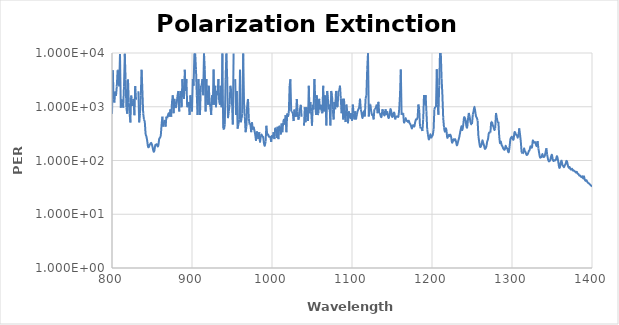
| Category | PER |
|---|---|
| 800.0 | 737.103 |
| 801.0 | 4788.855 |
| 802.0 | 1366.677 |
| 803.0 | 1195.963 |
| 804.0 | 1913.677 |
| 805.0 | 1595.165 |
| 806.0 | 2391.878 |
| 807.0 | 4781.694 |
| 808.0 | 4782.242 |
| 809.0 | 2396.13 |
| 810.0 | 9595.761 |
| 811.0 | 959.612 |
| 812.0 | 1371.975 |
| 813.0 | 1201.485 |
| 814.0 | 962.903 |
| 815.0 | 2406.201 |
| 816.0 | 9643.159 |
| 817.0 | 3214.255 |
| 818.0 | 964.865 |
| 819.0 | 743.864 |
| 820.0 | 3224.098 |
| 821.0 | 1207.928 |
| 822.0 | 744.744 |
| 823.0 | 509.599 |
| 824.0 | 1615.958 |
| 825.0 | 1212.327 |
| 826.0 | 1077.016 |
| 827.0 | 1387.672 |
| 828.0 | 693.208 |
| 829.0 | 2421.73 |
| 830.0 | 1385.673 |
| 831.0 | 1387.615 |
| 832.0 | 0 |
| 833.0 | 1939.557 |
| 834.0 | 511.584 |
| 835.0 | 749.014 |
| 836.0 | 1624.201 |
| 837.0 | 4882.862 |
| 838.0 | 1953.607 |
| 839.0 | 750.488 |
| 840.0 | 573.973 |
| 841.0 | 513.61 |
| 842.0 | 315.043 |
| 843.0 | 279.44 |
| 844.0 | 232.914 |
| 845.0 | 181.011 |
| 846.0 | 177.634 |
| 847.0 | 195.237 |
| 848.0 | 203.438 |
| 849.0 | 212.668 |
| 850.0 | 195.838 |
| 851.0 | 168.946 |
| 852.0 | 146.405 |
| 853.0 | 152.539 |
| 854.0 | 191.278 |
| 855.0 | 195.772 |
| 856.0 | 200.386 |
| 857.0 | 182.489 |
| 858.0 | 192.845 |
| 859.0 | 251.333 |
| 860.0 | 264.858 |
| 861.0 | 297.054 |
| 862.0 | 467.044 |
| 863.0 | 654.03 |
| 864.0 | 426.676 |
| 865.0 | 516.773 |
| 866.0 | 545.298 |
| 867.0 | 426.782 |
| 868.0 | 654.217 |
| 869.0 | 613.019 |
| 870.0 | 700.578 |
| 871.0 | 754.556 |
| 872.0 | 654.443 |
| 873.0 | 892.333 |
| 874.0 | 653.956 |
| 875.0 | 1226.405 |
| 876.0 | 1634.2 |
| 877.0 | 754.52 |
| 878.0 | 1401.837 |
| 879.0 | 1089.715 |
| 880.0 | 981.116 |
| 881.0 | 1225.779 |
| 882.0 | 1634.9 |
| 883.0 | 1962.476 |
| 884.0 | 816.847 |
| 885.0 | 1633.751 |
| 886.0 | 1963.447 |
| 887.0 | 982.719 |
| 888.0 | 3275.977 |
| 889.0 | 1963.737 |
| 890.0 | 1400.67 |
| 891.0 | 4900.434 |
| 892.0 | 1961.832 |
| 893.0 | 3270.673 |
| 894.0 | 980.692 |
| 895.0 | 1089.984 |
| 896.0 | 1226.172 |
| 897.0 | 700.899 |
| 898.0 | 1637.363 |
| 899.0 | 1227.803 |
| 900.0 | 818.158 |
| 901.0 | 3272.012 |
| 902.0 | 2454.371 |
| 903.0 | 9815.599 |
| 904.0 | 9812.111 |
| 905.0 | 4908.162 |
| 906.0 | 1636.228 |
| 907.0 | 701.612 |
| 908.0 | 3275.091 |
| 909.0 | 1636.558 |
| 910.0 | 701.516 |
| 911.0 | 2457.207 |
| 912.0 | 2457.059 |
| 913.0 | 3275.152 |
| 914.0 | 1637.171 |
| 915.0 | 9825.997 |
| 916.0 | 4911.372 |
| 917.0 | 818.448 |
| 918.0 | 3273.944 |
| 919.0 | 1402.382 |
| 920.0 | 1091.061 |
| 921.0 | 2455.551 |
| 922.0 | 1228.091 |
| 923.0 | 982.903 |
| 924.0 | 702.421 |
| 925.0 | 1639.226 |
| 926.0 | 1091.823 |
| 927.0 | 4911.736 |
| 928.0 | 1091.32 |
| 929.0 | 2456.52 |
| 930.0 | 982.404 |
| 931.0 | 1966.334 |
| 932.0 | 1637.967 |
| 933.0 | 3276.289 |
| 934.0 | 1228.192 |
| 935.0 | 1091.818 |
| 936.0 | 2453.744 |
| 937.0 | 979.465 |
| 938.0 | 9816.631 |
| 939.0 | 393.633 |
| 940.0 | 378.614 |
| 941.0 | 467.885 |
| 942.0 | 3267.977 |
| 943.0 | 9797.694 |
| 944.0 | 3269.194 |
| 945.0 | 614.281 |
| 946.0 | 817.61 |
| 947.0 | 1088.067 |
| 948.0 | 2450.653 |
| 949.0 | 1962.253 |
| 950.0 | 1227.758 |
| 951.0 | 467.017 |
| 952.0 | 9798.13 |
| 953.0 | 0 |
| 954.0 | 3268.432 |
| 955.0 | 701.321 |
| 956.0 | 1960.843 |
| 957.0 | 391.371 |
| 958.0 | 465.972 |
| 959.0 | 576.041 |
| 960.0 | 4893.011 |
| 961.0 | 513.867 |
| 962.0 | 611.043 |
| 963.0 | 753.47 |
| 964.0 | 9784.02 |
| 965.0 | 1221.152 |
| 966.0 | 650.6 |
| 967.0 | 335.922 |
| 968.0 | 423.876 |
| 969.0 | 1085.282 |
| 970.0 | 1395.947 |
| 971.0 | 611.496 |
| 972.0 | 465.059 |
| 973.0 | 464.493 |
| 974.0 | 336.791 |
| 975.0 | 514.587 |
| 976.0 | 375.463 |
| 977.0 | 424.71 |
| 978.0 | 361.35 |
| 979.0 | 305.458 |
| 980.0 | 232.666 |
| 981.0 | 348.257 |
| 982.0 | 314.024 |
| 983.0 | 250.127 |
| 984.0 | 336.204 |
| 985.0 | 216.995 |
| 986.0 | 286.875 |
| 987.0 | 304.134 |
| 988.0 | 278.801 |
| 989.0 | 270.866 |
| 990.0 | 207.451 |
| 991.0 | 187.554 |
| 992.0 | 226.837 |
| 993.0 | 443.208 |
| 994.0 | 295.499 |
| 995.0 | 314.592 |
| 996.0 | 278.592 |
| 997.0 | 278.634 |
| 998.0 | 270.592 |
| 999.0 | 221.259 |
| 1000.0 | 295.27 |
| 1001.0 | 270.65 |
| 1002.0 | 336.109 |
| 1003.0 | 250.033 |
| 1004.0 | 406.321 |
| 1005.0 | 389.936 |
| 1006.0 | 263.47 |
| 1007.0 | 423.781 |
| 1008.0 | 249.812 |
| 1009.0 | 442.256 |
| 1010.0 | 423.137 |
| 1011.0 | 303.88 |
| 1012.0 | 487.146 |
| 1013.0 | 336.042 |
| 1014.0 | 513.296 |
| 1015.0 | 573.591 |
| 1016.0 | 464.477 |
| 1017.0 | 696.339 |
| 1018.0 | 336.366 |
| 1019.0 | 750.556 |
| 1020.0 | 650.406 |
| 1021.0 | 750.573 |
| 1022.0 | 2438.492 |
| 1023.0 | 3251.029 |
| 1024.0 | 812.418 |
| 1025.0 | 813.068 |
| 1026.0 | 750.997 |
| 1027.0 | 542.495 |
| 1028.0 | 887.983 |
| 1029.0 | 697.57 |
| 1030.0 | 650.909 |
| 1031.0 | 1394.828 |
| 1032.0 | 813.587 |
| 1033.0 | 574.356 |
| 1034.0 | 651.883 |
| 1035.0 | 888.096 |
| 1036.0 | 1085.055 |
| 1037.0 | 651.294 |
| 1038.0 | 0 |
| 1039.0 | 0 |
| 1040.0 | 444.889 |
| 1041.0 | 978.456 |
| 1042.0 | 515.045 |
| 1043.0 | 978.001 |
| 1044.0 | 890.271 |
| 1045.0 | 544.031 |
| 1046.0 | 2450.793 |
| 1047.0 | 753.688 |
| 1048.0 | 1223.747 |
| 1049.0 | 816.515 |
| 1050.0 | 445.527 |
| 1051.0 | 1088.552 |
| 1052.0 | 890.792 |
| 1053.0 | 3271.507 |
| 1054.0 | 1401.226 |
| 1055.0 | 700.966 |
| 1056.0 | 1635.988 |
| 1057.0 | 700.816 |
| 1058.0 | 755.106 |
| 1059.0 | 1402.84 |
| 1060.0 | 893.398 |
| 1061.0 | 1091.719 |
| 1062.0 | 818.15 |
| 1063.0 | 755.755 |
| 1064.0 | 2457.127 |
| 1065.0 | 819.386 |
| 1066.0 | 1638.194 |
| 1067.0 | 1229.789 |
| 1068.0 | 447.178 |
| 1069.0 | 1968.098 |
| 1070.0 | 1406.486 |
| 1071.0 | 894.584 |
| 1072.0 | 1093.837 |
| 1073.0 | 447.803 |
| 1074.0 | 1968.649 |
| 1075.0 | 1641.851 |
| 1076.0 | 895.128 |
| 1077.0 | 578.98 |
| 1078.0 | 1230.849 |
| 1079.0 | 895.268 |
| 1080.0 | 1971.29 |
| 1081.0 | 986.099 |
| 1082.0 | 986.972 |
| 1083.0 | 1975.914 |
| 1084.0 | 1975.029 |
| 1085.0 | 2466.507 |
| 1086.0 | 1410.022 |
| 1087.0 | 759.526 |
| 1088.0 | 1410.106 |
| 1089.0 | 580.677 |
| 1090.0 | 1410.006 |
| 1091.0 | 705.156 |
| 1092.0 | 519.544 |
| 1093.0 | 1097.145 |
| 1094.0 | 823.164 |
| 1095.0 | 493.747 |
| 1096.0 | 822.317 |
| 1097.0 | 705.428 |
| 1098.0 | 617.599 |
| 1099.0 | 759.725 |
| 1100.0 | 548.681 |
| 1101.0 | 1097.368 |
| 1102.0 | 759.328 |
| 1103.0 | 580.733 |
| 1104.0 | 823.227 |
| 1105.0 | 580.719 |
| 1106.0 | 705.161 |
| 1107.0 | 823.462 |
| 1108.0 | 898.086 |
| 1109.0 | 987.746 |
| 1110.0 | 1411.689 |
| 1111.0 | 898.399 |
| 1112.0 | 760.439 |
| 1113.0 | 617.596 |
| 1114.0 | 706.065 |
| 1115.0 | 823.567 |
| 1116.0 | 658.312 |
| 1117.0 | 1409.34 |
| 1118.0 | 1644.177 |
| 1119.0 | 4939.936 |
| 1120.0 | 9885.886 |
| 1121.0 | 658.612 |
| 1122.0 | 1097.33 |
| 1123.0 | 1096.773 |
| 1124.0 | 823.124 |
| 1125.0 | 705.863 |
| 1126.0 | 705.424 |
| 1127.0 | 581.111 |
| 1128.0 | 898.062 |
| 1129.0 | 897.631 |
| 1130.0 | 986.979 |
| 1131.0 | 1096.644 |
| 1132.0 | 759.078 |
| 1133.0 | 1233.797 |
| 1134.0 | 759.207 |
| 1135.0 | 759.431 |
| 1136.0 | 658.3 |
| 1137.0 | 658.51 |
| 1138.0 | 898.391 |
| 1139.0 | 823.955 |
| 1140.0 | 706.1 |
| 1141.0 | 705.845 |
| 1142.0 | 897.851 |
| 1143.0 | 705.412 |
| 1144.0 | 822.916 |
| 1145.0 | 658.247 |
| 1146.0 | 617.33 |
| 1147.0 | 705.844 |
| 1148.0 | 898.408 |
| 1149.0 | 822.989 |
| 1150.0 | 658.642 |
| 1151.0 | 658.453 |
| 1152.0 | 759.828 |
| 1153.0 | 759.757 |
| 1154.0 | 581.051 |
| 1155.0 | 658.63 |
| 1156.0 | 658.868 |
| 1157.0 | 658.932 |
| 1158.0 | 659.157 |
| 1159.0 | 899.412 |
| 1160.0 | 1648.303 |
| 1161.0 | 4949.016 |
| 1162.0 | 707.063 |
| 1163.0 | 760.471 |
| 1164.0 | 760.403 |
| 1165.0 | 494.404 |
| 1166.0 | 549.266 |
| 1167.0 | 617.999 |
| 1168.0 | 549.211 |
| 1169.0 | 549.276 |
| 1170.0 | 520.327 |
| 1171.0 | 549.13 |
| 1172.0 | 494.232 |
| 1173.0 | 470.735 |
| 1174.0 | 429.821 |
| 1175.0 | 395.196 |
| 1176.0 | 449.12 |
| 1177.0 | 449.186 |
| 1178.0 | 429.82 |
| 1179.0 | 520.463 |
| 1180.0 | 582.177 |
| 1181.0 | 582.189 |
| 1182.0 | 618.72 |
| 1183.0 | 1100.18 |
| 1184.0 | 899.906 |
| 1185.0 | 430.151 |
| 1186.0 | 395.689 |
| 1187.0 | 395.823 |
| 1188.0 | 353.457 |
| 1189.0 | 583.026 |
| 1190.0 | 1653.66 |
| 1191.0 | 1102.325 |
| 1192.0 | 1653.53 |
| 1193.0 | 826.584 |
| 1194.0 | 381.054 |
| 1195.0 | 299.962 |
| 1196.0 | 247.445 |
| 1197.0 | 267.477 |
| 1198.0 | 309.362 |
| 1199.0 | 267.709 |
| 1200.0 | 282.949 |
| 1201.0 | 300.465 |
| 1202.0 | 381.477 |
| 1203.0 | 901.881 |
| 1204.0 | 992.73 |
| 1205.0 | 993.73 |
| 1206.0 | 4974.092 |
| 1207.0 | 1105.846 |
| 1208.0 | 710.486 |
| 1209.0 | 2486.616 |
| 1210.0 | 9954.512 |
| 1211.0 | 9952.098 |
| 1212.0 | 3316.954 |
| 1213.0 | 1659.253 |
| 1214.0 | 622.172 |
| 1215.0 | 414.663 |
| 1216.0 | 343.102 |
| 1217.0 | 397.79 |
| 1218.0 | 368.225 |
| 1219.0 | 268.546 |
| 1220.0 | 275.62 |
| 1221.0 | 300.602 |
| 1222.0 | 283.838 |
| 1223.0 | 301.462 |
| 1224.0 | 268.981 |
| 1225.0 | 216.301 |
| 1226.0 | 225.897 |
| 1227.0 | 248.298 |
| 1228.0 | 236.602 |
| 1229.0 | 248.576 |
| 1230.0 | 226.035 |
| 1231.0 | 191.313 |
| 1232.0 | 207.07 |
| 1233.0 | 236.54 |
| 1234.0 | 269.07 |
| 1235.0 | 321.744 |
| 1236.0 | 383.59 |
| 1237.0 | 433.278 |
| 1238.0 | 369.016 |
| 1239.0 | 452.949 |
| 1240.0 | 623.546 |
| 1241.0 | 624.06 |
| 1242.0 | 554.729 |
| 1243.0 | 434.042 |
| 1244.0 | 415.74 |
| 1245.0 | 586.895 |
| 1246.0 | 768.152 |
| 1247.0 | 666.34 |
| 1248.0 | 526.006 |
| 1249.0 | 475.645 |
| 1250.0 | 475.693 |
| 1251.0 | 713.427 |
| 1252.0 | 833.021 |
| 1253.0 | 999.583 |
| 1254.0 | 832.662 |
| 1255.0 | 666.667 |
| 1256.0 | 624.286 |
| 1257.0 | 554.231 |
| 1258.0 | 284.799 |
| 1259.0 | 221.425 |
| 1260.0 | 181.135 |
| 1261.0 | 181.043 |
| 1262.0 | 199.018 |
| 1263.0 | 236.868 |
| 1264.0 | 211.77 |
| 1265.0 | 191.315 |
| 1266.0 | 165.677 |
| 1267.0 | 168.542 |
| 1268.0 | 184.13 |
| 1269.0 | 225.909 |
| 1270.0 | 248.914 |
| 1271.0 | 321.338 |
| 1272.0 | 332.267 |
| 1273.0 | 332.446 |
| 1274.0 | 524.719 |
| 1275.0 | 524.865 |
| 1276.0 | 453.036 |
| 1277.0 | 415.169 |
| 1278.0 | 369.482 |
| 1279.0 | 398.983 |
| 1280.0 | 766.953 |
| 1281.0 | 623.626 |
| 1282.0 | 524.75 |
| 1283.0 | 524.529 |
| 1284.0 | 284.62 |
| 1285.0 | 211.549 |
| 1286.0 | 225.78 |
| 1287.0 | 194.883 |
| 1288.0 | 183.958 |
| 1289.0 | 168.289 |
| 1290.0 | 160.11 |
| 1291.0 | 160.171 |
| 1292.0 | 187.35 |
| 1293.0 | 171.077 |
| 1294.0 | 168.109 |
| 1295.0 | 148.092 |
| 1296.0 | 143.91 |
| 1297.0 | 183.781 |
| 1298.0 | 248.297 |
| 1299.0 | 268.316 |
| 1300.0 | 275.676 |
| 1301.0 | 248.282 |
| 1302.0 | 248.186 |
| 1303.0 | 330.792 |
| 1304.0 | 330.878 |
| 1305.0 | 300.735 |
| 1306.0 | 300.672 |
| 1307.0 | 268.098 |
| 1308.0 | 267.861 |
| 1309.0 | 396.578 |
| 1310.0 | 309.827 |
| 1311.0 | 224.89 |
| 1312.0 | 143.344 |
| 1313.0 | 135.35 |
| 1314.0 | 139.084 |
| 1315.0 | 167.493 |
| 1316.0 | 149.656 |
| 1317.0 | 142.983 |
| 1318.0 | 128.009 |
| 1319.0 | 128.023 |
| 1320.0 | 134.946 |
| 1321.0 | 149.303 |
| 1322.0 | 156.386 |
| 1323.0 | 182.695 |
| 1324.0 | 176.295 |
| 1325.0 | 176.348 |
| 1326.0 | 235.044 |
| 1327.0 | 219.404 |
| 1328.0 | 214.48 |
| 1329.0 | 219.166 |
| 1330.0 | 197.22 |
| 1331.0 | 185.935 |
| 1332.0 | 229.301 |
| 1333.0 | 166.87 |
| 1334.0 | 136.535 |
| 1335.0 | 114.109 |
| 1336.0 | 115.39 |
| 1337.0 | 116.726 |
| 1338.0 | 132.488 |
| 1339.0 | 118.036 |
| 1340.0 | 116.735 |
| 1341.0 | 122.512 |
| 1342.0 | 144.161 |
| 1343.0 | 169.082 |
| 1344.0 | 127.301 |
| 1345.0 | 106.336 |
| 1346.0 | 96.805 |
| 1347.0 | 97.667 |
| 1348.0 | 103.834 |
| 1349.0 | 120.76 |
| 1350.0 | 126.996 |
| 1351.0 | 102.826 |
| 1352.0 | 97.5 |
| 1353.0 | 101.573 |
| 1354.0 | 100.442 |
| 1355.0 | 104.71 |
| 1356.0 | 120.337 |
| 1357.0 | 110.806 |
| 1358.0 | 91.066 |
| 1359.0 | 73.784 |
| 1360.0 | 76.05 |
| 1361.0 | 91.725 |
| 1362.0 | 99.011 |
| 1363.0 | 82.89 |
| 1364.0 | 78.777 |
| 1365.0 | 75.108 |
| 1366.0 | 81.632 |
| 1367.0 | 86.635 |
| 1368.0 | 98.115 |
| 1369.0 | 93.387 |
| 1370.0 | 79.454 |
| 1371.0 | 73.335 |
| 1372.0 | 75.612 |
| 1373.0 | 69.187 |
| 1374.0 | 67.742 |
| 1375.0 | 70.096 |
| 1376.0 | 65.406 |
| 1377.0 | 65.684 |
| 1378.0 | 63.188 |
| 1379.0 | 62.285 |
| 1380.0 | 59.527 |
| 1381.0 | 61.435 |
| 1382.0 | 56.799 |
| 1383.0 | 56.077 |
| 1384.0 | 52.757 |
| 1385.0 | 52.635 |
| 1386.0 | 50.219 |
| 1387.0 | 48.895 |
| 1388.0 | 50.639 |
| 1389.0 | 46.243 |
| 1390.0 | 50.685 |
| 1391.0 | 43.91 |
| 1392.0 | 41.777 |
| 1393.0 | 43.017 |
| 1394.0 | 40.31 |
| 1395.0 | 38.514 |
| 1396.0 | 37.579 |
| 1397.0 | 36.421 |
| 1398.0 | 35.185 |
| 1399.0 | 33.897 |
| 1400.0 | 32.764 |